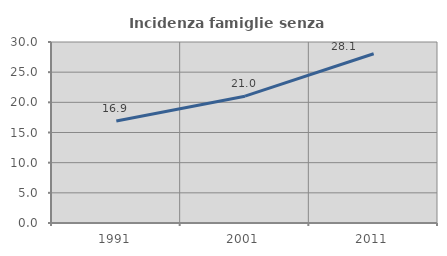
| Category | Incidenza famiglie senza nuclei |
|---|---|
| 1991.0 | 16.907 |
| 2001.0 | 21.022 |
| 2011.0 | 28.06 |